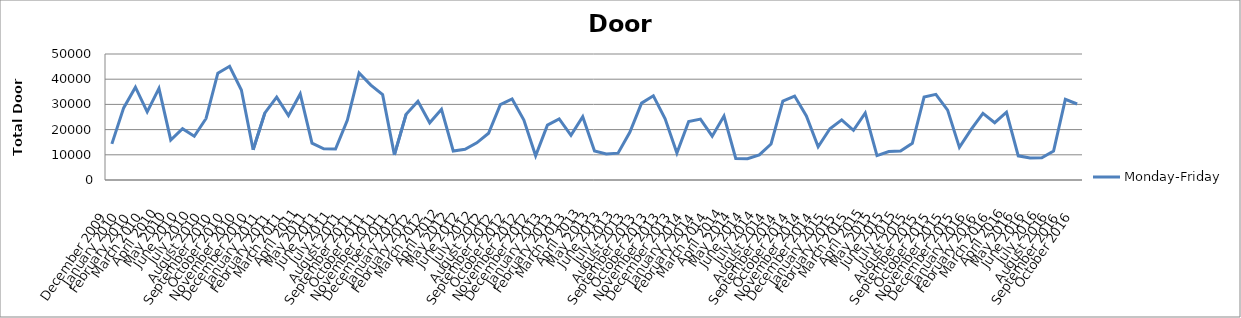
| Category | Monday-Friday |
|---|---|
| December 2009 | 14336.92 |
| January 2010 | 28609.88 |
| February 2010 | 36831.6 |
| March 2010 | 27042.6 |
| April 2010 | 36377.12 |
| May 2010 | 15890.16 |
| June 2010 | 20377.24 |
| July 2010 | 17355.52 |
| August 2010 | 24412.44 |
| September 2010 | 42365.96 |
| October 2010 | 45107.4 |
| November 2010 | 35707.88 |
| December 2010 | 12002.64 |
| January 2011 | 26642.72 |
| February 2011 | 32858.28 |
| March 2011 | 25595.96 |
| April 2011 | 34146.32 |
| May 2011 | 14625.52 |
| June 2011 | 12367.16 |
| July 2011 | 12300.6 |
| August 2011 | 23668.32 |
| September 2011 | 42448.64 |
| October 2011 | 37640.2 |
| November 2011 | 33863.96 |
| December 2011 | 9963.2 |
| January 2012 | 26110.76 |
| February 2012 | 31233.28 |
| March 2012 | 22702.68 |
| April 2012 | 28028 |
| May 2012 | 11508.12 |
| June 2012 | 12201.8 |
| July 2012 | 14748.24 |
| August 2012 | 18566.6 |
| September 2012 | 29891.68 |
| October 2012 | 32154.72 |
| November 2012 | 23814.44 |
| December 2012 | 9644.96 |
| January 2013 | 21783.84 |
| February 2013 | 24239.8 |
| March 2013 | 17742.4 |
| April 2013 | 25141.48 |
| May 2013 | 11552.84 |
| June 2013 | 10311.6 |
| July 2013 | 10664.68 |
| August 2013 | 18905.12 |
| September 2013 | 30513.6 |
| October 2013 | 33394.4 |
| November 2013 | 24314.16 |
| December 2013 | 10727.08 |
| January 2014 | 23202.92 |
| February 2014 | 24150.36 |
| March 2014 | 17399.2 |
| April 2014 | 25388.48 |
| May 2014 | 8542.04 |
| June 2014 | 8443.76 |
| July 2014 | 9939.28 |
| August 2014 | 14295.84 |
| September 2014 | 31335.72 |
| October 2014 | 33318.48 |
| November 2014 | 25388.48 |
| December 2014 | 13175.24 |
| January 2015 | 20334.6 |
| February 2015 | 23842.52 |
| March 2015 | 19731.4 |
| April 2015 | 26609.44 |
| May 2015 | 9657.96 |
| June 2015 | 11302.2 |
| July 2015 | 11459.24 |
| August 2015 | 14536.08 |
| September 2015 | 32932.64 |
| October 2015 | 33985.64 |
| November 2015 | 27716 |
| December 2015 | 12937.08 |
| January 2016 | 20085 |
| February 2016 | 26451.36 |
| March 2016 | 22734.92 |
| April 2016 | 26888.68 |
| May 2016 | 9591.4 |
| June 2016 | 8735.48 |
| July 2016 | 8808.28 |
| August 2016 | 11493.04 |
| September 2016 | 32017.96 |
| October 2016 | 30157.4 |